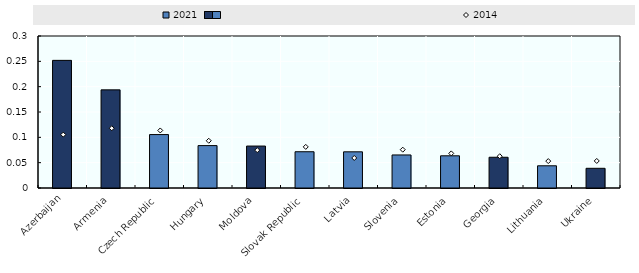
| Category | 2021 |
|---|---|
| Azerbaijan | 0.252 |
| Armenia | 0.194 |
| Czech Republic | 0.105 |
| Hungary | 0.084 |
| Moldova | 0.083 |
| Slovak Republic | 0.072 |
| Latvia | 0.071 |
| Slovenia | 0.065 |
| Estonia | 0.064 |
| Georgia | 0.061 |
| Lithuania | 0.044 |
| Ukraine | 0.039 |